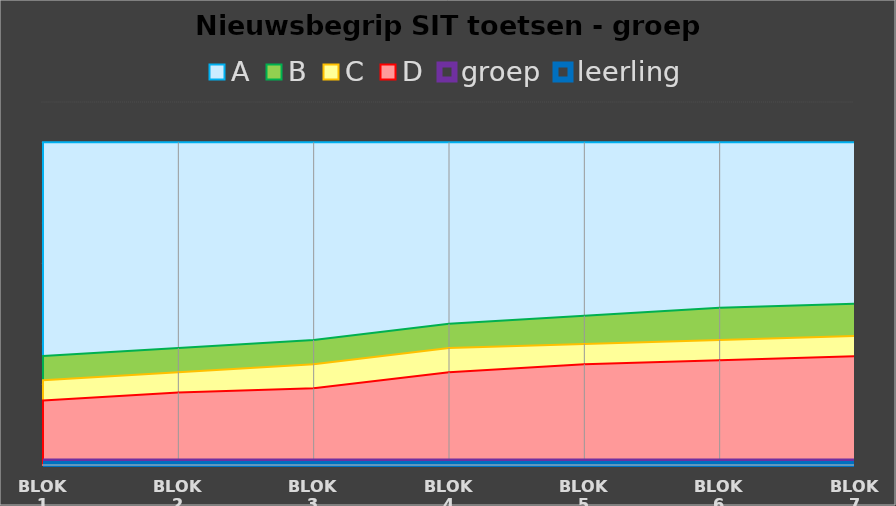
| Category | A | B | C | D | groep | leerling |
|---|---|---|---|---|---|---|
| blok 1 | 40 | 13.5 | 10.5 | 8 | 0 | 0 |
| blok 2 | 40 | 14.5 | 11.5 | 9 | 0 | 0 |
| blok 3 | 40 | 15.5 | 12.5 | 9.5 | 0 | 0 |
| blok 4 | 40 | 17.5 | 14.5 | 11.5 | 0 | 0 |
| blok 5 | 40 | 18.5 | 15 | 12.5 | 0 | 0 |
| blok 6 | 40 | 19.5 | 15.5 | 13 | 0 | 0 |
| blok 7 | 40 | 20 | 16 | 13.5 | 0 | 0 |